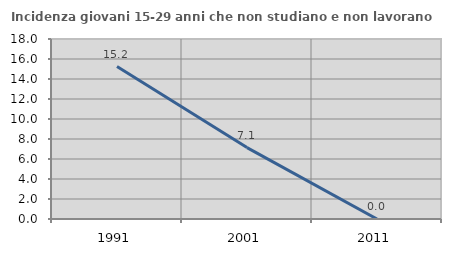
| Category | Incidenza giovani 15-29 anni che non studiano e non lavorano  |
|---|---|
| 1991.0 | 15.24 |
| 2001.0 | 7.143 |
| 2011.0 | 0 |